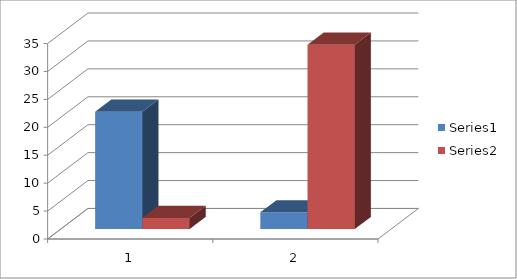
| Category | Series 0 | Series 1 |
|---|---|---|
| 0 | 21 | 2 |
| 1 | 3 | 33 |